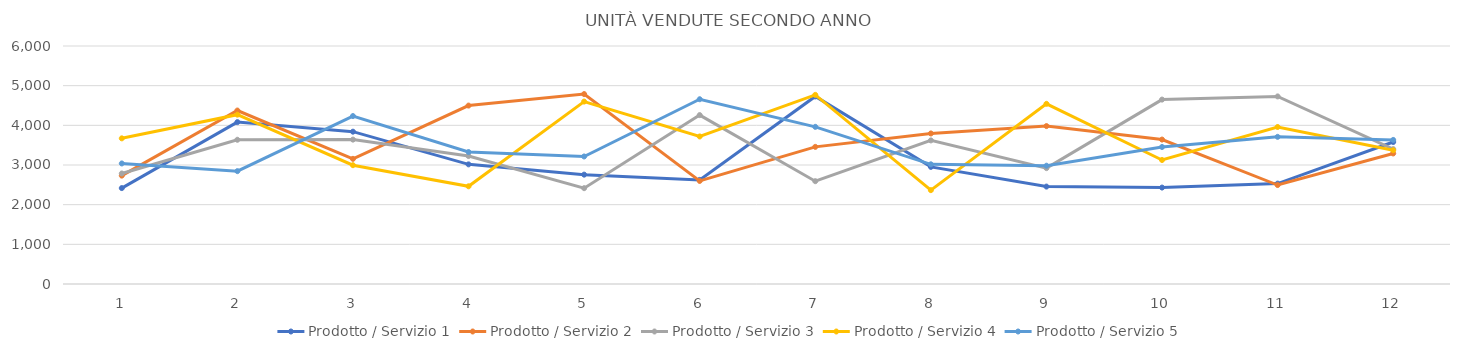
| Category | Prodotto / Servizio 1 | Prodotto / Servizio 2 | Prodotto / Servizio 3 | Prodotto / Servizio 4 | Prodotto / Servizio 5 |
|---|---|---|---|---|---|
| 0 | 2418 | 2732 | 2786 | 3672 | 3039 |
| 1 | 4081 | 4373 | 3636 | 4269 | 2845 |
| 2 | 3840 | 3155 | 3640 | 2995 | 4234 |
| 3 | 3016 | 4498 | 3226 | 2463 | 3327 |
| 4 | 2757 | 4788 | 2416 | 4599 | 3215 |
| 5 | 2625 | 2598 | 4258 | 3719 | 4658 |
| 6 | 4729 | 3457 | 2592 | 4768 | 3962 |
| 7 | 2952 | 3795 | 3620 | 2366 | 3017 |
| 8 | 2456 | 3981 | 2921 | 4542 | 2982 |
| 9 | 2431 | 3641 | 4649 | 3126 | 3454 |
| 10 | 2531 | 2495 | 4729 | 3958 | 3710 |
| 11 | 3580 | 3291 | 3400 | 3372 | 3632 |